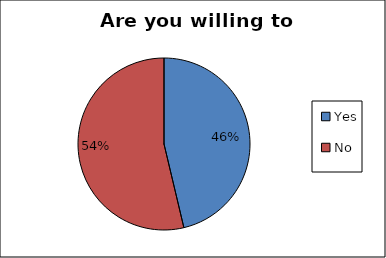
| Category | Series 0 |
|---|---|
| Yes | 0.463 |
| No | 0.537 |